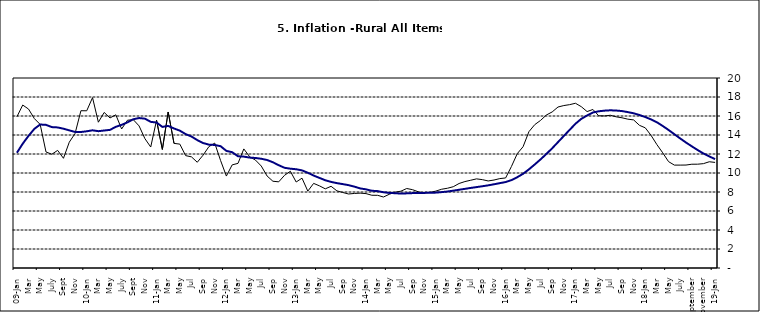
| Category | Series 0 | Series 1 |
|---|---|---|
| 09-Jan | 15.918 | 12.128 |
| Feb | 17.154 | 13.086 |
| Mar | 16.729 | 13.912 |
| Apr | 15.727 | 14.644 |
| May | 15.113 | 15.104 |
| June | 12.213 | 15.067 |
| July | 11.974 | 14.832 |
| Aug | 12.38 | 14.796 |
| Sept | 11.548 | 14.661 |
| Oct | 13.242 | 14.488 |
| Nov | 14.164 | 14.321 |
|  | 16.557 | 14.316 |
| 10-Jan | 16.548 | 14.39 |
| Feb | 17.934 | 14.494 |
| Mar | 15.346 | 14.401 |
| Apr | 16.373 | 14.473 |
| May | 15.794 | 14.54 |
| June | 16.126 | 14.862 |
| July | 14.634 | 15.072 |
| Aug | 15.556 | 15.33 |
| Sept | 15.616 | 15.658 |
| Oct | 14.955 | 15.786 |
| Nov | 13.616 | 15.719 |
| Dec | 12.735 | 15.385 |
| 11-Jan | 15.553 | 15.311 |
| Feb | 12.482 | 14.856 |
| Mar | 16.422 | 14.956 |
| Apr | 13.117 | 14.687 |
| May | 13.041 | 14.457 |
| Jun | 11.83 | 14.095 |
| Jul | 11.699 | 13.84 |
| Aug | 11.13 | 13.464 |
| Sep | 11.878 | 13.156 |
| Oct | 12.778 | 12.985 |
| Nov | 13.147 | 12.95 |
| Dec | 11.326 | 12.824 |
| 12-Jan | 9.678 | 12.33 |
| Feb | 10.856 | 12.188 |
| Mar | 11.014 | 11.76 |
| Apr | 12.536 | 11.724 |
| May | 11.712 | 11.621 |
| Jun | 11.36 | 11.582 |
| Jul | 10.733 | 11.499 |
| Aug | 9.683 | 11.368 |
| Sep | 9.132 | 11.131 |
| Oct | 9.071 | 10.82 |
| Nov | 9.758 | 10.548 |
| Dec | 10.183 | 10.455 |
| 13-Jan | 9.052 | 10.394 |
| Feb | 9.457 | 10.276 |
| Mar | 8.091 | 10.025 |
| Apr | 8.907 | 9.732 |
| May | 8.647 | 9.483 |
| Jun | 8.333 | 9.236 |
| Jul | 8.6 | 9.063 |
| Aug | 8.12 | 8.933 |
| Sep | 7.95 | 8.832 |
| Oct | 7.791 | 8.722 |
| Nov | 7.849 | 8.565 |
| Dec | 7.879 | 8.378 |
| 14-Jan | 7.832 | 8.277 |
| Feb | 7.657 | 8.13 |
| Mar | 7.65 | 8.092 |
| Apr | 7.473 | 7.973 |
| May | 7.761 | 7.901 |
| Jun | 7.98 | 7.874 |
| Jul | 8.086 | 7.834 |
| Aug | 8.368 | 7.858 |
| Sep | 8.244 | 7.883 |
| Oct | 8.019 | 7.903 |
| Nov | 7.898 | 7.906 |
| Dec | 7.955 | 7.913 |
| 15-Jan | 8.094 | 7.935 |
| Feb | 8.291 | 7.988 |
| Mar | 8.396 | 8.05 |
| Apr | 8.556 | 8.14 |
| May | 8.896 | 8.236 |
| Jun | 9.098 | 8.331 |
| Jul | 9.238 | 8.429 |
| Aug | 9.382 | 8.516 |
| Sep | 9.3 | 8.606 |
| Oct | 9.162 | 8.7 |
| Nov | 9.261 | 8.813 |
| Dec | 9.41 | 8.933 |
| 16-Jan | 9.48 | 9.047 |
| Feb | 10.692 | 9.249 |
| Mar | 12.038 | 9.559 |
| Apr | 12.767 | 9.917 |
| May | 14.349 | 10.384 |
| Jun | 15.088 | 10.897 |
| Jul | 15.533 | 11.433 |
| Aug | 16.103 | 12.002 |
| Sep | 16.428 | 12.601 |
| Oct | 16.947 | 13.25 |
| Nov | 17.099 | 13.898 |
| Dec | 17.195 | 14.54 |
| 17-Jan | 17.341 | 15.183 |
| Feb | 16.982 | 15.696 |
| Mar | 16.466 | 16.054 |
| Apr | 16.687 | 16.369 |
| May | 16.023 | 16.497 |
| Jun | 16.007 | 16.563 |
| Jul | 16.078 | 16.6 |
| Aug | 15.914 | 16.577 |
| Sep | 15.812 | 16.52 |
| Oct | 15.666 | 16.411 |
| Nov | 15.587 | 16.285 |
| Dec | 15.018 | 16.104 |
| 18-Jan | 14.756 | 15.892 |
| Feb | 13.957 | 15.638 |
| Mar | 12.987 | 15.339 |
| Apr | 12.126 | 14.95 |
| May | 11.199 | 14.53 |
| June | 10.832 | 14.083 |
| July | 10.831 | 13.636 |
| August | 10.838 | 13.209 |
| September | 10.924 | 12.804 |
| October | 10.927 | 12.418 |
| November | 10.986 | 12.049 |
| December | 11.183 | 11.746 |
| 19-Jan | 11.115 | 11.462 |